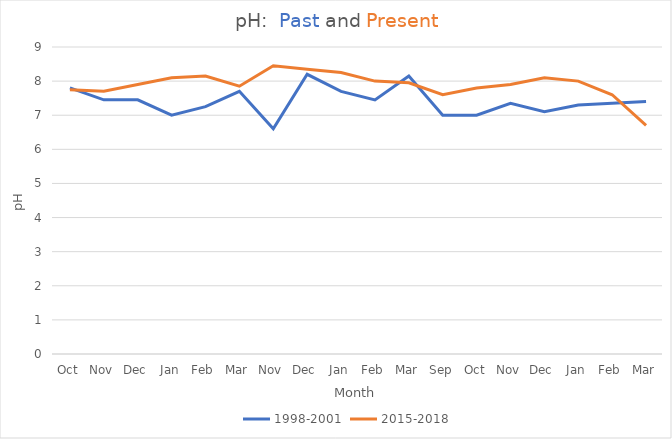
| Category | 1998-2001 | 2015-2018 |
|---|---|---|
| Oct | 7.8 | 7.75 |
| Nov | 7.45 | 7.7 |
| Dec | 7.45 | 7.9 |
| Jan | 7 | 8.1 |
| Feb | 7.25 | 8.15 |
| Mar | 7.7 | 7.85 |
| Nov | 6.6 | 8.45 |
| Dec | 8.2 | 8.35 |
| Jan | 7.7 | 8.25 |
| Feb | 7.45 | 8 |
| Mar | 8.15 | 7.95 |
| Sep | 7 | 7.6 |
| Oct | 7 | 7.8 |
| Nov | 7.35 | 7.9 |
| Dec | 7.1 | 8.1 |
| Jan | 7.3 | 8 |
| Feb | 7.35 | 7.6 |
| Mar | 7.4 | 6.7 |